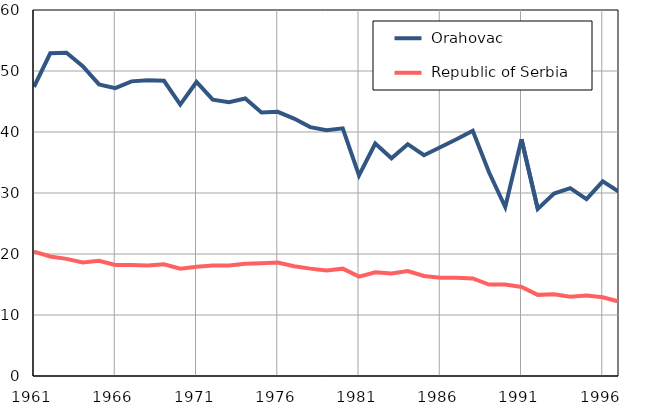
| Category |  Orahovac |  Republic of Serbia |
|---|---|---|
| 1961.0 | 47.4 | 20.4 |
| 1962.0 | 52.9 | 19.6 |
| 1963.0 | 53 | 19.2 |
| 1964.0 | 50.8 | 18.6 |
| 1965.0 | 47.8 | 18.9 |
| 1966.0 | 47.2 | 18.2 |
| 1967.0 | 48.3 | 18.2 |
| 1968.0 | 48.5 | 18.1 |
| 1969.0 | 48.4 | 18.3 |
| 1970.0 | 44.5 | 17.6 |
| 1971.0 | 48.2 | 17.9 |
| 1972.0 | 45.3 | 18.1 |
| 1973.0 | 44.9 | 18.1 |
| 1974.0 | 45.5 | 18.4 |
| 1975.0 | 43.2 | 18.5 |
| 1976.0 | 43.3 | 18.6 |
| 1977.0 | 42.2 | 18 |
| 1978.0 | 40.8 | 17.6 |
| 1979.0 | 40.3 | 17.3 |
| 1980.0 | 40.6 | 17.6 |
| 1981.0 | 32.9 | 16.3 |
| 1982.0 | 38.1 | 17 |
| 1983.0 | 35.7 | 16.8 |
| 1984.0 | 38 | 17.2 |
| 1985.0 | 36.2 | 16.4 |
| 1986.0 | 37.5 | 16.1 |
| 1987.0 | 38.8 | 16.1 |
| 1988.0 | 40.2 | 16 |
| 1989.0 | 33.4 | 15 |
| 1990.0 | 27.7 | 15 |
| 1991.0 | 38.8 | 14.6 |
| 1992.0 | 27.4 | 13.3 |
| 1993.0 | 29.9 | 13.4 |
| 1994.0 | 30.8 | 13 |
| 1995.0 | 29 | 13.2 |
| 1996.0 | 31.9 | 12.9 |
| 1997.0 | 30.2 | 12.2 |